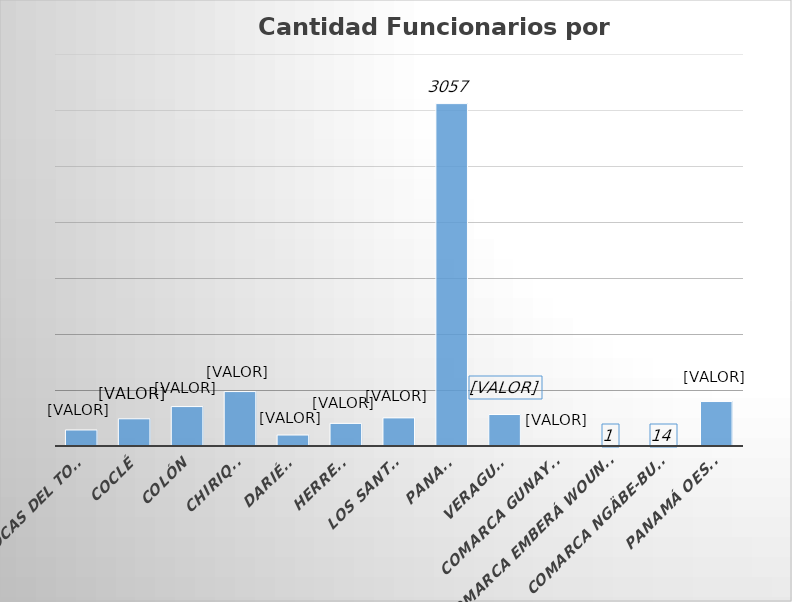
| Category | Cantidad  |
|---|---|
| BOCAS DEL TORO | 143 |
| COCLÉ | 243 |
| COLÓN | 352 |
| CHIRIQUÍ | 486 |
| DARIÉN | 98 |
| HERRERA | 202 |
| LOS SANTOS | 251 |
| PANAMÁ | 3057 |
| VERAGUAS | 281 |
| COMARCA GUNAYALA | 7 |
| COMARCA EMBERÁ WOUNAAN | 1 |
| COMARCA NGÄBE-BUGLÉ | 14 |
| PANAMÁ OESTE | 397 |